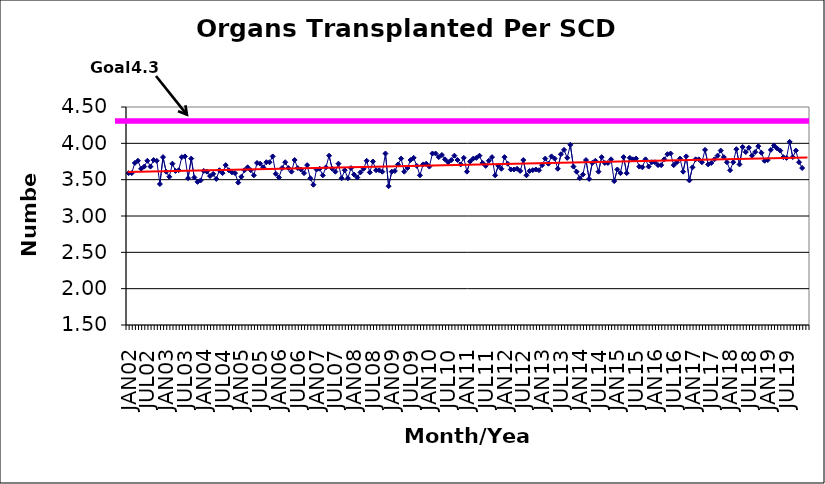
| Category | Series 0 |
|---|---|
| JAN02 | 3.59 |
| FEB02 | 3.59 |
| MAR02 | 3.73 |
| APR02 | 3.76 |
| MAY02 | 3.65 |
| JUN02 | 3.68 |
| JUL02 | 3.76 |
| AUG02 | 3.68 |
| SEP02 | 3.77 |
| OCT02 | 3.76 |
| NOV02 | 3.44 |
| DEC02 | 3.81 |
| JAN03 | 3.61 |
| FEB03 | 3.54 |
| MAR03 | 3.72 |
| APR03 | 3.62 |
| MAY03 | 3.63 |
| JUN03 | 3.81 |
| JUL03 | 3.82 |
| AUG03 | 3.52 |
| SEP03 | 3.79 |
| OCT03 | 3.53 |
| NOV03 | 3.47 |
| DEC03 | 3.49 |
| JAN04 | 3.62 |
| FEB04 | 3.61 |
| MAR04 | 3.55 |
| APR04 | 3.58 |
| MAY04 | 3.51 |
| JUN04 | 3.63 |
| JUL04 | 3.59 |
| AUG04 | 3.7 |
| SEP04 | 3.63 |
| OCT04 | 3.6 |
| NOV04 | 3.59 |
| DEC04 | 3.46 |
| JAN05 | 3.54 |
| FEB05 | 3.63 |
| MAR05 | 3.67 |
| APR05 | 3.63 |
| MAY05 | 3.56 |
| JUN05 | 3.73 |
| JUL05 | 3.72 |
| AUG05 | 3.67 |
| SEP05 | 3.74 |
| OCT05 | 3.74 |
| NOV05 | 3.82 |
| DEC05 | 3.58 |
| JAN06 | 3.53 |
| FEB06 | 3.66 |
| MAR06 | 3.74 |
| APR06 | 3.66 |
| MAY06 | 3.61 |
| JUN06 | 3.77 |
| JUL06 | 3.66 |
| AUG06 | 3.64 |
| SEP06 | 3.59 |
| OCT06 | 3.7 |
| NOV06 | 3.52 |
| DEC06 | 3.43 |
| JAN07 | 3.64 |
| FEB07 | 3.65 |
| MAR07 | 3.56 |
| APR07 | 3.67 |
| MAY07 | 3.83 |
| JUN07 | 3.65 |
| JUL07 | 3.61 |
| AUG07 | 3.72 |
| SEP07 | 3.52 |
| OCT07 | 3.63 |
| NOV07 | 3.52 |
| DEC07 | 3.66 |
| JAN08 | 3.57 |
| FEB08 | 3.53 |
| MAR08 | 3.6 |
| APR08 | 3.65 |
| MAY08 | 3.76 |
| JUN08 | 3.6 |
| JUL08 | 3.75 |
| AUG08 | 3.63 |
| SEP08 | 3.63 |
| OCT08 | 3.61 |
| NOV08 | 3.86 |
| DEC08 | 3.41 |
| JAN09 | 3.61 |
| FEB09 | 3.62 |
| MAR09 | 3.71 |
| APR09 | 3.79 |
| MAY09 | 3.61 |
| JUN09 | 3.66 |
| JUL09 | 3.77 |
| AUG09 | 3.8 |
| SEP09 | 3.69 |
| OCT09 | 3.56 |
| NOV09 | 3.71 |
| DEC09 | 3.72 |
| JAN10 | 3.68 |
| FEB10 | 3.86 |
| MAR10 | 3.86 |
| APR10 | 3.81 |
| MAY10 | 3.84 |
| JUN10 | 3.78 |
| JUL10 | 3.74 |
| AUG10 | 3.77 |
| SEP10 | 3.83 |
| OCT10 | 3.77 |
| NOV10 | 3.71 |
| DEC10 | 3.8 |
| JAN11 | 3.61 |
| FEB11 | 3.75 |
| MAR11 | 3.79 |
| APR11 | 3.8 |
| MAY11 | 3.83 |
| JUN11 | 3.73 |
| JUL11 | 3.69 |
| AUG11 | 3.76 |
| SEP11 | 3.81 |
| OCT11 | 3.56 |
| NOV11 | 3.69 |
| DEC11 | 3.65 |
| JAN12 | 3.81 |
| FEB12 | 3.72 |
| MAR12 | 3.64 |
| APR12 | 3.64 |
| MAY12 | 3.65 |
| JUN12 | 3.62 |
| JUL12 | 3.77 |
| AUG12 | 3.56 |
| SEP12 | 3.62 |
| OCT12 | 3.63 |
| NOV12 | 3.64 |
| DEC12 | 3.63 |
| JAN13 | 3.7 |
| FEB13 | 3.79 |
| MAR13 | 3.72 |
| APR13 | 3.82 |
| MAY13 | 3.79 |
| JUN13 | 3.65 |
| JUL13 | 3.85 |
| AUG13 | 3.91 |
| SEP13 | 3.8 |
| OCT13 | 3.98 |
| NOV13 | 3.68 |
| DEC13 | 3.61 |
| JAN14 | 3.52 |
| FEB14 | 3.57 |
| MAR14 | 3.77 |
| APR14 | 3.51 |
| MAY14 | 3.73 |
| JUN14 | 3.76 |
| JUL14 | 3.61 |
| AUG14 | 3.81 |
| SEP14 | 3.73 |
| OCT14 | 3.73 |
| NOV14 | 3.78 |
| DEC14 | 3.48 |
| JAN15 | 3.64 |
| FEB15 | 3.59 |
| MAR15 | 3.81 |
| APR15 | 3.59 |
| MAY15 | 3.8 |
| JUN15 | 3.78 |
| JUL15 | 3.79 |
| AUG15 | 3.68 |
| SEP15 | 3.67 |
| OCT15 | 3.78 |
| NOV15 | 3.68 |
| DEC15 | 3.74 |
| JAN16 | 3.74 |
| FEB16 | 3.7 |
| MAR16 | 3.7 |
| APR16 | 3.78 |
| MAY16 | 3.85 |
| JUN16 | 3.86 |
| JUL16 | 3.7 |
| AUG16 | 3.74 |
| SEP16 | 3.79 |
| OCT16 | 3.61 |
| NOV16 | 3.82 |
| DEC16 | 3.49 |
| JAN17 | 3.67 |
| FEB17 | 3.78 |
| MAR17 | 3.78 |
| APR17 | 3.74 |
| MAY17 | 3.91 |
| JUN17 | 3.71 |
| JUL17 | 3.73 |
| AUG17 | 3.78 |
| SEP17 | 3.83 |
| OCT17 | 3.9 |
| NOV17 | 3.81 |
| DEC17 | 3.74 |
| JAN18 | 3.63 |
| FEB18 | 3.74 |
| MAR18 | 3.92 |
| APR18 | 3.71 |
| MAY18 | 3.95 |
| JUN18 | 3.88 |
| JUL18 | 3.94 |
| AUG18 | 3.83 |
| SEP18 | 3.88 |
| OCT18 | 3.96 |
| NOV18 | 3.87 |
| DEC18 | 3.76 |
| JAN19 | 3.77 |
| FEB19 | 3.91 |
| MAR19 | 3.97 |
| APR19 | 3.93 |
| MAY19 | 3.9 |
| JUN19 | 3.81 |
| JUL19 | 3.8 |
| AUG19 | 4.02 |
| SEP19 | 3.81 |
| OCT19 | 3.9 |
| NOV19 | 3.74 |
| DEC19 | 3.66 |